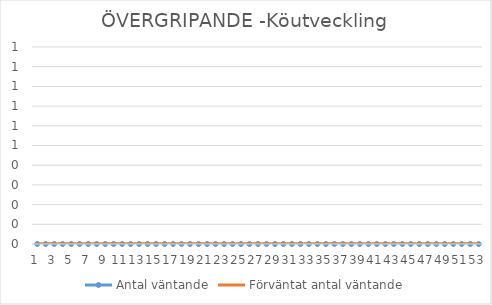
| Category | Antal väntande | Förväntat antal väntande | Vecka |
|---|---|---|---|
| 0 | 0 | 0 |  |
| 1 | 0 | 0 |  |
| 2 | 0 | 0 |  |
| 3 | 0 | 0 |  |
| 4 | 0 | 0 |  |
| 5 | 0 | 0 |  |
| 6 | 0 | 0 |  |
| 7 | 0 | 0 |  |
| 8 | 0 | 0 |  |
| 9 | 0 | 0 |  |
| 10 | 0 | 0 |  |
| 11 | 0 | 0 |  |
| 12 | 0 | 0 |  |
| 13 | 0 | 0 |  |
| 14 | 0 | 0 |  |
| 15 | 0 | 0 |  |
| 16 | 0 | 0 |  |
| 17 | 0 | 0 |  |
| 18 | 0 | 0 |  |
| 19 | 0 | 0 |  |
| 20 | 0 | 0 |  |
| 21 | 0 | 0 |  |
| 22 | 0 | 0 |  |
| 23 | 0 | 0 |  |
| 24 | 0 | 0 |  |
| 25 | 0 | 0 |  |
| 26 | 0 | 0 |  |
| 27 | 0 | 0 |  |
| 28 | 0 | 0 |  |
| 29 | 0 | 0 |  |
| 30 | 0 | 0 |  |
| 31 | 0 | 0 |  |
| 32 | 0 | 0 |  |
| 33 | 0 | 0 |  |
| 34 | 0 | 0 |  |
| 35 | 0 | 0 |  |
| 36 | 0 | 0 |  |
| 37 | 0 | 0 |  |
| 38 | 0 | 0 |  |
| 39 | 0 | 0 |  |
| 40 | 0 | 0 |  |
| 41 | 0 | 0 |  |
| 42 | 0 | 0 |  |
| 43 | 0 | 0 |  |
| 44 | 0 | 0 |  |
| 45 | 0 | 0 |  |
| 46 | 0 | 0 |  |
| 47 | 0 | 0 |  |
| 48 | 0 | 0 |  |
| 49 | 0 | 0 |  |
| 50 | 0 | 0 |  |
| 51 | 0 | 0 |  |
| 52 | 0 | 0 |  |